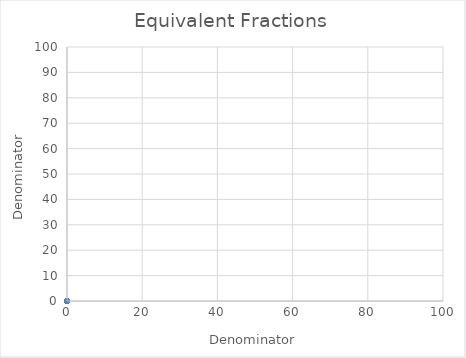
| Category | Numerator |
|---|---|
| 0.0 | 0 |
| 0.0 | 0 |
| 0.0 | 0 |
| 0.0 | 0 |
| 0.0 | 0 |
| 0.0 | 0 |
| 0.0 | 0 |
| 0.0 | 0 |
| 0.0 | 0 |
| 0.0 | 0 |
| 0.0 | 0 |
| 0.0 | 0 |
| 0.0 | 0 |
| 0.0 | 0 |
| 0.0 | 0 |
| 0.0 | 0 |
| 0.0 | 0 |
| 0.0 | 0 |
| 0.0 | 0 |
| 0.0 | 0 |